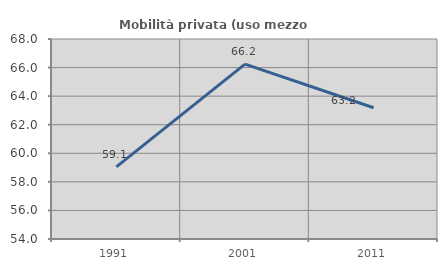
| Category | Mobilità privata (uso mezzo privato) |
|---|---|
| 1991.0 | 59.053 |
| 2001.0 | 66.238 |
| 2011.0 | 63.19 |